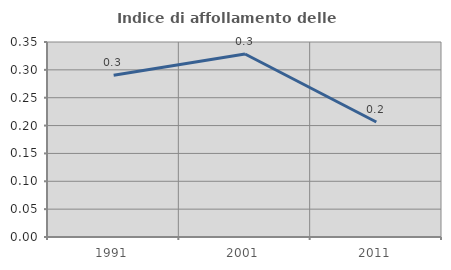
| Category | Indice di affollamento delle abitazioni  |
|---|---|
| 1991.0 | 0.29 |
| 2001.0 | 0.328 |
| 2011.0 | 0.206 |